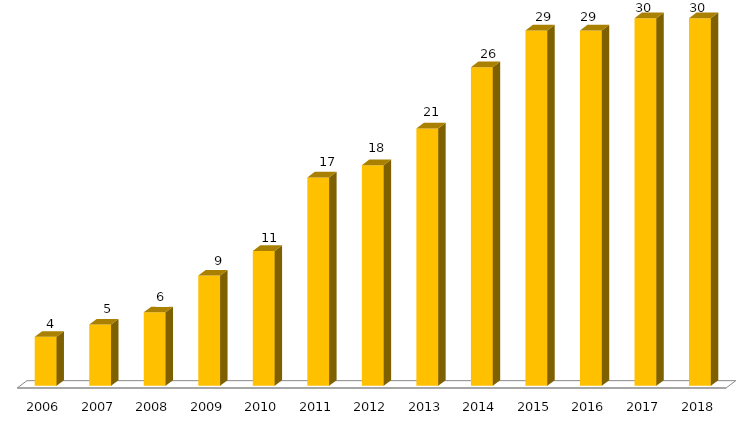
| Category | Pós - Graduação UFGD |
|---|---|
| 2006.0 | 4 |
| 2007.0 | 5 |
| 2008.0 | 6 |
| 2009.0 | 9 |
| 2010.0 | 11 |
| 2011.0 | 17 |
| 2012.0 | 18 |
| 2013.0 | 21 |
| 2014.0 | 26 |
| 2015.0 | 29 |
| 2016.0 | 29 |
| 2017.0 | 30 |
| 2018.0 | 30 |